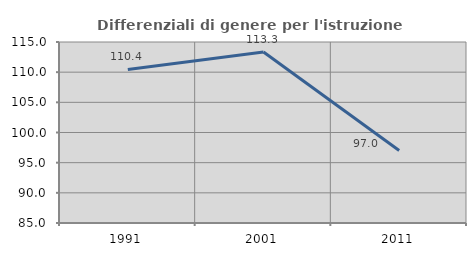
| Category | Differenziali di genere per l'istruzione superiore |
|---|---|
| 1991.0 | 110.445 |
| 2001.0 | 113.328 |
| 2011.0 | 97.018 |